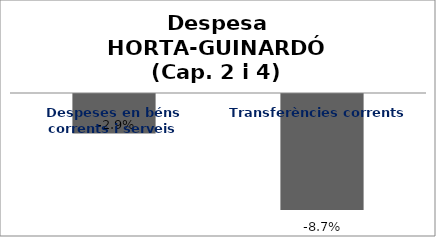
| Category | Series 0 |
|---|---|
| Despeses en béns corrents i serveis | -0.029 |
| Transferències corrents | -0.087 |